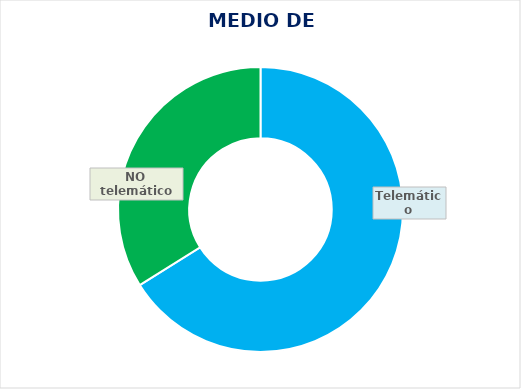
| Category | PORCENTAJE |
|---|---|
| Telemático | 0.661 |
| NO telemático | 0.339 |